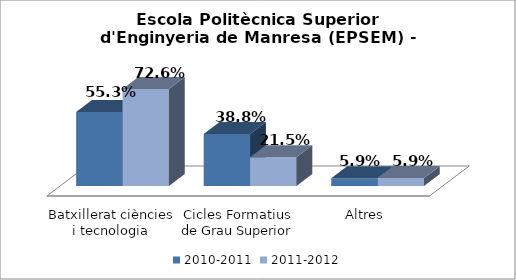
| Category | 2010-2011 | 2011-2012 |
|---|---|---|
| Batxillerat ciències i tecnologia | 0.553 | 0.726 |
| Cicles Formatius de Grau Superior | 0.388 | 0.215 |
| Altres | 0.059 | 0.059 |